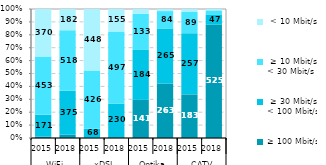
| Category | ≥ 100 Mbit/s  |  ≥ 30 Mbit/s 
< 100 Mbit/s |  ≥ 10 Mbit/s 
< 30 Mbit/s |  < 10 Mbit/s  |
|---|---|---|---|---|
| 0 | 11.255 | 170.887 | 452.758 | 369.529 |
| 1 | 29.38 | 374.855 | 518.355 | 182.084 |
| 2 | 0 | 67.51 | 425.505 | 448.325 |
| 3 | 6.071 | 229.972 | 497.461 | 154.716 |
| 4 | 140.777 | 184.294 | 133.104 | 17.911 |
| 5 | 263.223 | 264.668 | 84.354 | 10.101 |
| 6 | 183.142 | 256.663 | 89.052 | 12.517 |
| 7 | 524.701 | 46.849 | 18.86 | 6.3 |